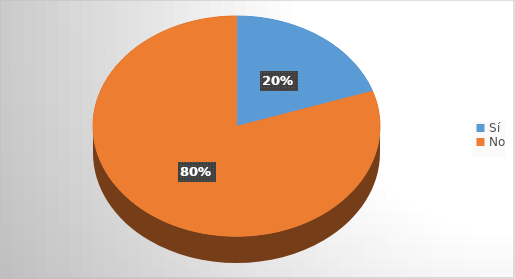
| Category | Series 0 |
|---|---|
| Sí | 115 |
| No | 466 |